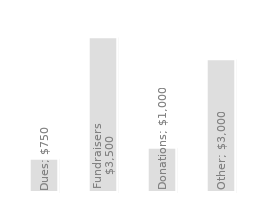
| Category | Yearly Revenue |
|---|---|
| Dues | 750 |
| Fundraisers | 3500 |
| Donations | 1000 |
| Other | 3000 |